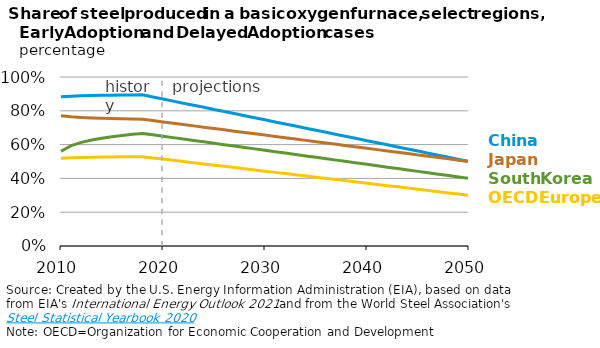
| Category | China | Japan | South Korea | OECD Europe |
|---|---|---|---|---|
| 2010.0 | 0.883 | 0.771 | 0.56 | 0.52 |
| 2011.0 | 0.887 | 0.764 | 0.594 | 0.522 |
| 2012.0 | 0.889 | 0.76 | 0.613 | 0.524 |
| 2013.0 | 0.89 | 0.758 | 0.627 | 0.525 |
| 2014.0 | 0.891 | 0.756 | 0.638 | 0.526 |
| 2015.0 | 0.892 | 0.754 | 0.647 | 0.527 |
| 2016.0 | 0.893 | 0.752 | 0.654 | 0.527 |
| 2017.0 | 0.894 | 0.751 | 0.661 | 0.528 |
| 2018.0 | 0.894 | 0.75 | 0.666 | 0.528 |
| 2019.0 | 0.882 | 0.742 | 0.658 | 0.521 |
| 2020.0 | 0.87 | 0.734 | 0.65 | 0.514 |
| 2021.0 | 0.857 | 0.726 | 0.641 | 0.507 |
| 2022.0 | 0.845 | 0.719 | 0.633 | 0.5 |
| 2023.0 | 0.833 | 0.711 | 0.625 | 0.493 |
| 2024.0 | 0.82 | 0.703 | 0.616 | 0.486 |
| 2025.0 | 0.808 | 0.695 | 0.608 | 0.478 |
| 2026.0 | 0.796 | 0.687 | 0.6 | 0.471 |
| 2027.0 | 0.783 | 0.68 | 0.591 | 0.464 |
| 2028.0 | 0.771 | 0.672 | 0.583 | 0.457 |
| 2029.0 | 0.759 | 0.664 | 0.575 | 0.45 |
| 2030.0 | 0.746 | 0.656 | 0.566 | 0.443 |
| 2031.0 | 0.734 | 0.648 | 0.558 | 0.436 |
| 2032.0 | 0.722 | 0.641 | 0.55 | 0.429 |
| 2033.0 | 0.71 | 0.633 | 0.541 | 0.421 |
| 2034.0 | 0.697 | 0.625 | 0.533 | 0.414 |
| 2035.0 | 0.685 | 0.617 | 0.525 | 0.407 |
| 2036.0 | 0.673 | 0.609 | 0.516 | 0.4 |
| 2037.0 | 0.66 | 0.602 | 0.508 | 0.393 |
| 2038.0 | 0.648 | 0.594 | 0.5 | 0.386 |
| 2039.0 | 0.636 | 0.586 | 0.492 | 0.379 |
| 2040.0 | 0.623 | 0.578 | 0.483 | 0.371 |
| 2041.0 | 0.611 | 0.57 | 0.475 | 0.364 |
| 2042.0 | 0.599 | 0.562 | 0.467 | 0.357 |
| 2043.0 | 0.586 | 0.555 | 0.458 | 0.35 |
| 2044.0 | 0.574 | 0.547 | 0.45 | 0.343 |
| 2045.0 | 0.562 | 0.539 | 0.442 | 0.336 |
| 2046.0 | 0.549 | 0.531 | 0.433 | 0.329 |
| 2047.0 | 0.537 | 0.523 | 0.425 | 0.321 |
| 2048.0 | 0.525 | 0.516 | 0.417 | 0.314 |
| 2049.0 | 0.512 | 0.508 | 0.408 | 0.307 |
| 2050.0 | 0.5 | 0.5 | 0.4 | 0.3 |